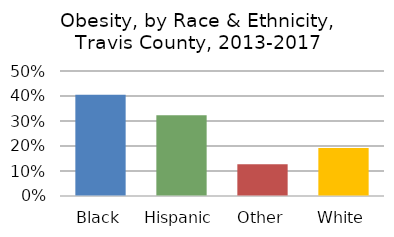
| Category | Series 0 |
|---|---|
| Black | 0.405 |
| Hispanic | 0.323 |
| Other | 0.127 |
| White | 0.192 |